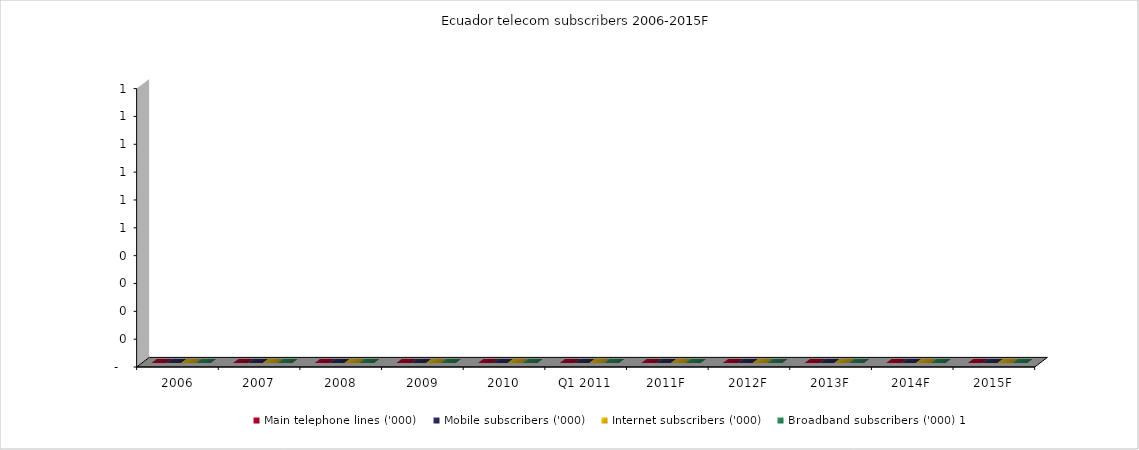
| Category | Main telephone lines ('000) | Mobile subscribers ('000) | Internet subscribers ('000) | Broadband subscribers ('000) 1 |
|---|---|---|---|---|
| 2006 | 0 | 0 | 0 | 0 |
| 2007 | 0 | 0 | 0 | 0 |
| 2008 | 0 | 0 | 0 | 0 |
| 2009 | 0 | 0 | 0 | 0 |
| 2010 | 0 | 0 | 0 | 0 |
| Q1 2011 | 0 | 0 | 0 | 0 |
| 2011F | 0 | 0 | 0 | 0 |
| 2012F | 0 | 0 | 0 | 0 |
| 2013F | 0 | 0 | 0 | 0 |
| 2014F | 0 | 0 | 0 | 0 |
| 2015F | 0 | 0 | 0 | 0 |